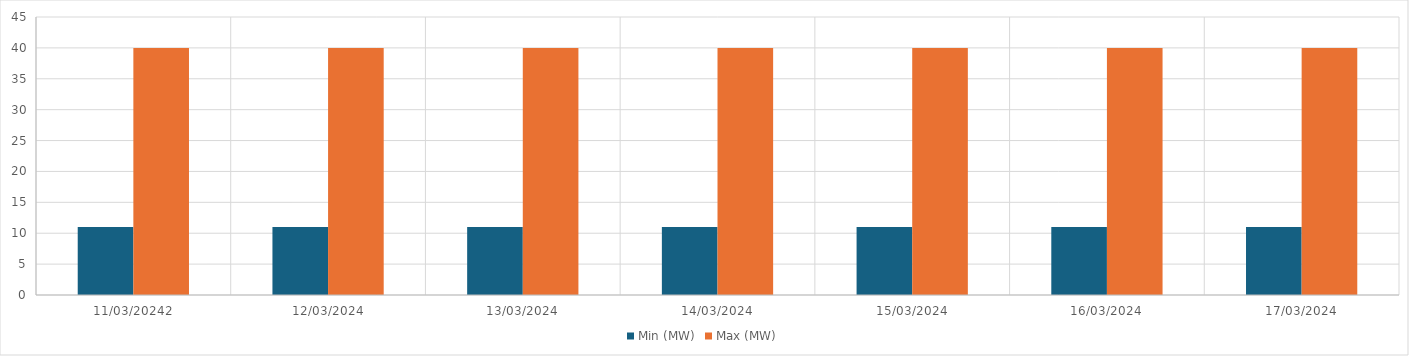
| Category | Min (MW) | Max (MW) |
|---|---|---|
| 11/03/20242 | 11 | 40 |
| 12/03/2024 | 11 | 40 |
| 13/03/2024 | 11 | 40 |
| 14/03/2024 | 11 | 40 |
| 15/03/2024 | 11 | 40 |
| 16/03/2024 | 11 | 40 |
| 17/03/2024 | 11 | 40 |